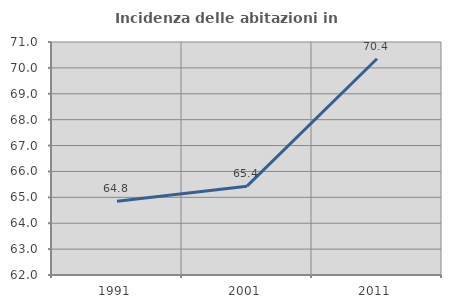
| Category | Incidenza delle abitazioni in proprietà  |
|---|---|
| 1991.0 | 64.846 |
| 2001.0 | 65.432 |
| 2011.0 | 70.351 |